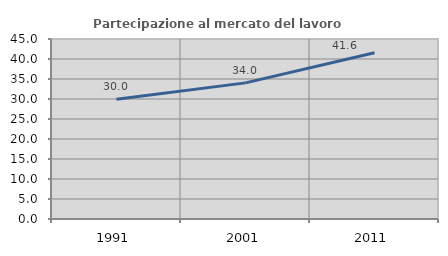
| Category | Partecipazione al mercato del lavoro  femminile |
|---|---|
| 1991.0 | 29.957 |
| 2001.0 | 34.033 |
| 2011.0 | 41.557 |